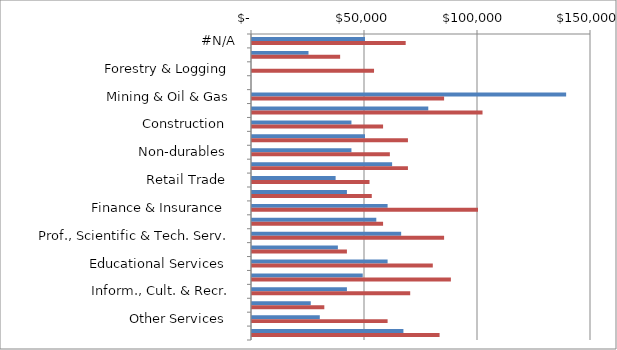
| Category | Series 0 | Series 1 |
|---|---|---|
|  #N/A  | 50000 | 68000 |
|  Agriculture   | 25000 | 39000 |
|  Forestry & Logging  | 0 | 54000 |
|  Fishing, Hunting & Trapping   | 0 | 0 |
|  Mining & Oil & Gas  | 139000 | 85000 |
|  Utilities   | 78000 | 102000 |
|  Construction   | 44000 | 58000 |
|  Durables   | 50000 | 69000 |
|  Non-durables   | 44000 | 61000 |
|  Wholesale Trade   | 62000 | 69000 |
|  Retail Trade   | 37000 | 52000 |
|  Transportation & Warehousing   | 42000 | 53000 |
|  Finance & Insurance   | 60000 | 100000 |
|  Real Estate & Leasing   | 55000 | 58000 |
|  Prof., Scientific & Tech. Serv.  | 66000 | 85000 |
|  Bus., building & support serv.  | 38000 | 42000 |
|  Educational Services   | 60000 | 80000 |
|  Health Care & Social Assistance   | 49000 | 88000 |
|  Inform., Cult. & Recr.  | 42000 | 70000 |
|  Accomm. & Food Services   | 26000 | 32000 |
|  Other Services   | 30000 | 60000 |
|  Public Administration   | 67000 | 83000 |